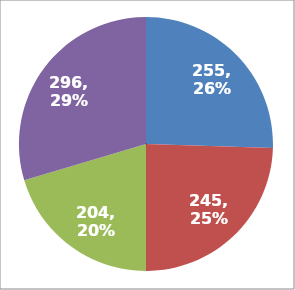
| Category | Series 0 |
|---|---|
| 0 | 255 |
| 1 | 245 |
| 2 | 204 |
| 3 | 296 |